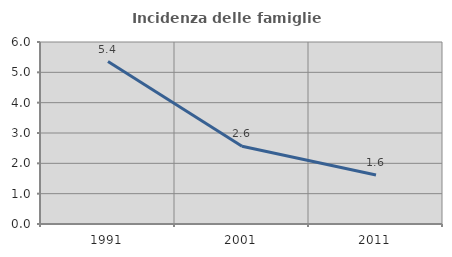
| Category | Incidenza delle famiglie numerose |
|---|---|
| 1991.0 | 5.354 |
| 2001.0 | 2.565 |
| 2011.0 | 1.614 |